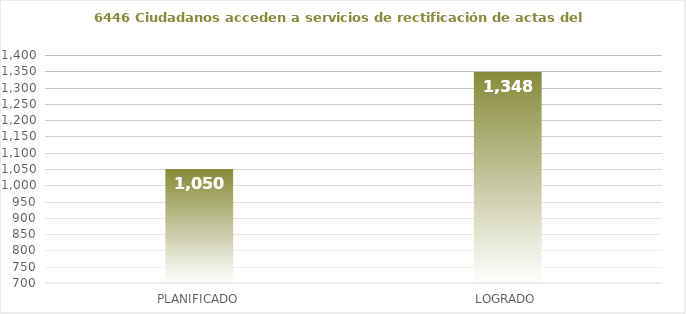
| Category | 6446 |
|---|---|
| PLANIFICADO | 1050 |
| LOGRADO | 1348 |